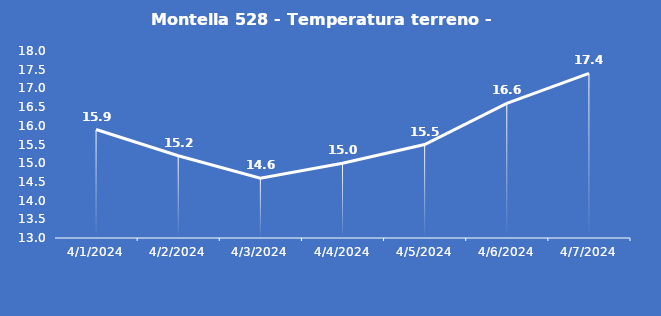
| Category | Montella 528 - Temperatura terreno - Grezzo (°C) |
|---|---|
| 4/1/24 | 15.9 |
| 4/2/24 | 15.2 |
| 4/3/24 | 14.6 |
| 4/4/24 | 15 |
| 4/5/24 | 15.5 |
| 4/6/24 | 16.6 |
| 4/7/24 | 17.4 |